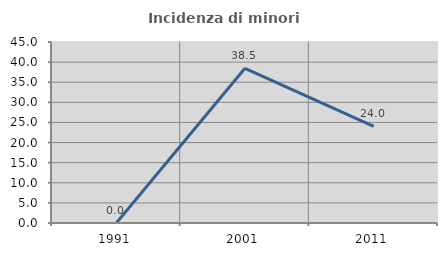
| Category | Incidenza di minori stranieri |
|---|---|
| 1991.0 | 0 |
| 2001.0 | 38.462 |
| 2011.0 | 24 |